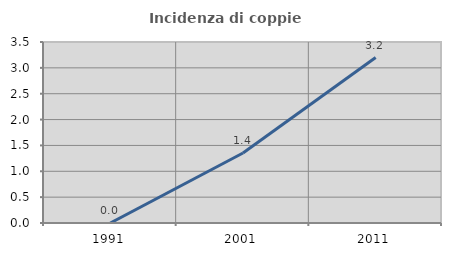
| Category | Incidenza di coppie miste |
|---|---|
| 1991.0 | 0 |
| 2001.0 | 1.353 |
| 2011.0 | 3.2 |